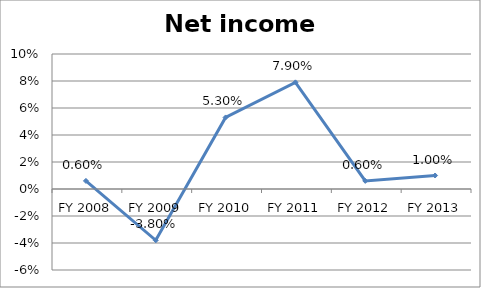
| Category | Net income ratio |
|---|---|
| FY 2013 | 0.01 |
| FY 2012 | 0.006 |
| FY 2011 | 0.079 |
| FY 2010 | 0.053 |
| FY 2009 | -0.038 |
| FY 2008 | 0.006 |